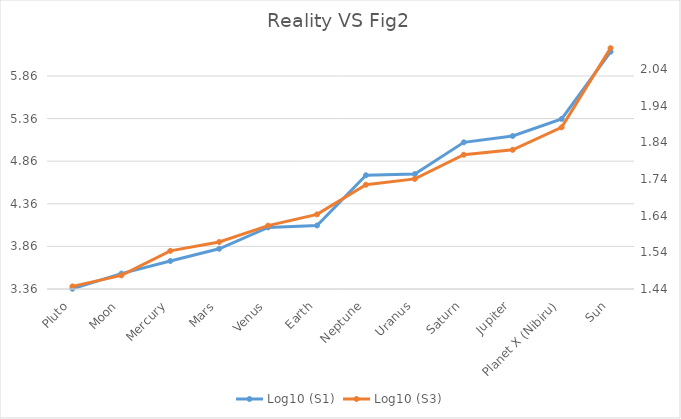
| Category | Log10 (S1) |
|---|---|
| Pluto | 3.363 |
| Moon | 3.541 |
| Mercury | 3.688 |
| Mars | 3.832 |
| Venus | 4.083 |
| Earth | 4.106 |
| Neptune | 4.695 |
| Uranus | 4.709 |
| Saturn | 5.081 |
| Jupiter | 5.155 |
| Planet X (Nibiru) | 5.356 |
| Sun | 6.144 |